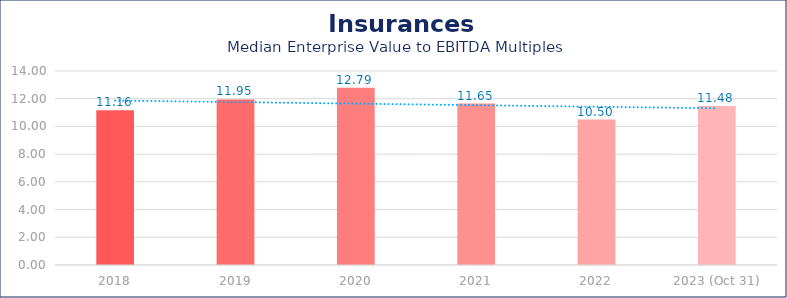
| Category | Insurances |
|---|---|
| 2018 | 11.16 |
| 2019 | 11.95 |
| 2020 | 12.79 |
| 2021 | 11.65 |
| 2022 | 10.5 |
| 2023 (Oct 31) | 11.48 |